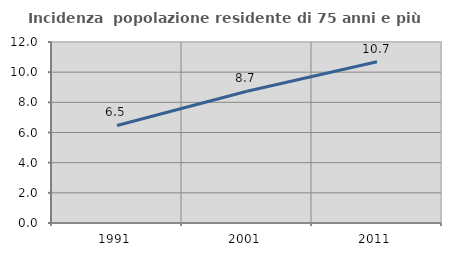
| Category | Incidenza  popolazione residente di 75 anni e più |
|---|---|
| 1991.0 | 6.468 |
| 2001.0 | 8.731 |
| 2011.0 | 10.686 |